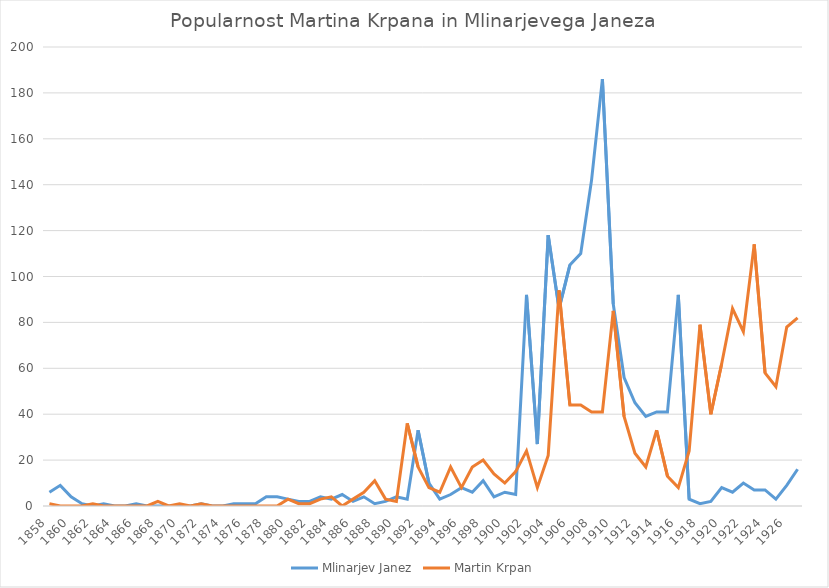
| Category | Mlinarjev Janez | Martin Krpan |
|---|---|---|
| 1858.0 | 6 | 1 |
| 1859.0 | 9 | 0 |
| 1860.0 | 4 | 0 |
| 1861.0 | 1 | 0 |
| 1862.0 | 0 | 1 |
| 1863.0 | 1 | 0 |
| 1864.0 | 0 | 0 |
| 1865.0 | 0 | 0 |
| 1866.0 | 1 | 0 |
| 1867.0 | 0 | 0 |
| 1868.0 | 0 | 2 |
| 1869.0 | 0 | 0 |
| 1870.0 | 0 | 1 |
| 1871.0 | 0 | 0 |
| 1872.0 | 1 | 1 |
| 1873.0 | 0 | 0 |
| 1874.0 | 0 | 0 |
| 1875.0 | 1 | 0 |
| 1876.0 | 1 | 0 |
| 1877.0 | 1 | 0 |
| 1878.0 | 4 | 0 |
| 1879.0 | 4 | 0 |
| 1880.0 | 3 | 3 |
| 1881.0 | 2 | 1 |
| 1882.0 | 2 | 1 |
| 1883.0 | 4 | 3 |
| 1884.0 | 3 | 4 |
| 1885.0 | 5 | 0 |
| 1886.0 | 2 | 3 |
| 1887.0 | 4 | 6 |
| 1888.0 | 1 | 11 |
| 1889.0 | 2 | 3 |
| 1890.0 | 4 | 2 |
| 1891.0 | 3 | 36 |
| 1892.0 | 33 | 17 |
| 1893.0 | 10 | 8 |
| 1894.0 | 3 | 6 |
| 1895.0 | 5 | 17 |
| 1896.0 | 8 | 8 |
| 1897.0 | 6 | 17 |
| 1898.0 | 11 | 20 |
| 1899.0 | 4 | 14 |
| 1900.0 | 6 | 10 |
| 1901.0 | 5 | 15 |
| 1902.0 | 92 | 24 |
| 1903.0 | 27 | 8 |
| 1904.0 | 118 | 22 |
| 1905.0 | 86 | 94 |
| 1906.0 | 105 | 44 |
| 1907.0 | 110 | 44 |
| 1908.0 | 142 | 41 |
| 1909.0 | 186 | 41 |
| 1910.0 | 88 | 85 |
| 1911.0 | 56 | 39 |
| 1912.0 | 45 | 23 |
| 1913.0 | 39 | 17 |
| 1914.0 | 41 | 33 |
| 1915.0 | 41 | 13 |
| 1916.0 | 92 | 8 |
| 1917.0 | 3 | 24 |
| 1918.0 | 1 | 79 |
| 1919.0 | 2 | 40 |
| 1920.0 | 8 | 62 |
| 1921.0 | 6 | 86 |
| 1922.0 | 10 | 76 |
| 1923.0 | 7 | 114 |
| 1924.0 | 7 | 58 |
| 1925.0 | 3 | 52 |
| 1926.0 | 9 | 78 |
| 1927.0 | 16 | 82 |